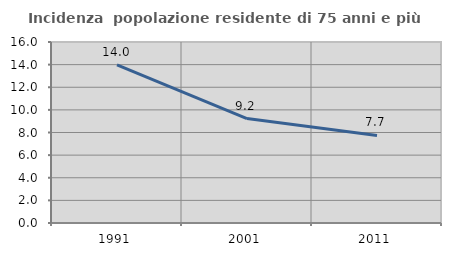
| Category | Incidenza  popolazione residente di 75 anni e più |
|---|---|
| 1991.0 | 13.971 |
| 2001.0 | 9.231 |
| 2011.0 | 7.74 |